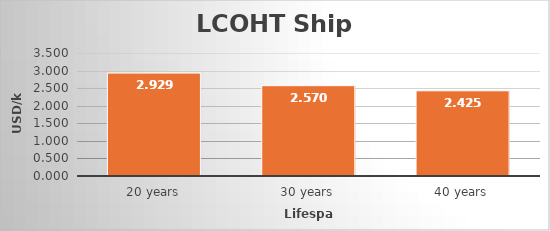
| Category | LCOHT_ship_CGH2 |
|---|---|
| 20 years | 2.929 |
| 30 years | 2.57 |
| 40 years | 2.425 |